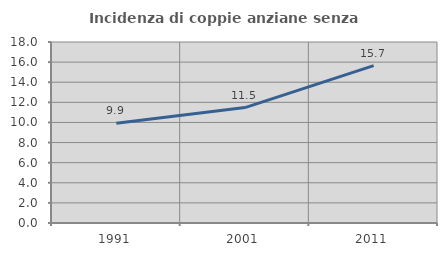
| Category | Incidenza di coppie anziane senza figli  |
|---|---|
| 1991.0 | 9.924 |
| 2001.0 | 11.475 |
| 2011.0 | 15.652 |